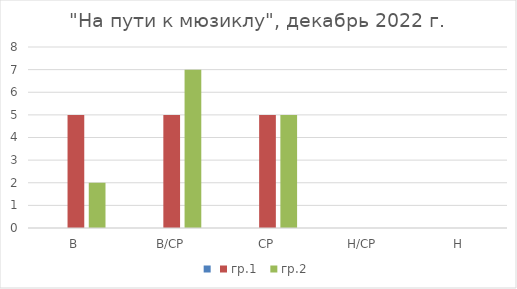
| Category | Series 0 | гр.1  | гр.2 |
|---|---|---|---|
| В |  | 5 | 2 |
| В/СР |  | 5 | 7 |
| СР |  | 5 | 5 |
| Н/СР |  | 0 | 0 |
| Н |  | 0 | 0 |